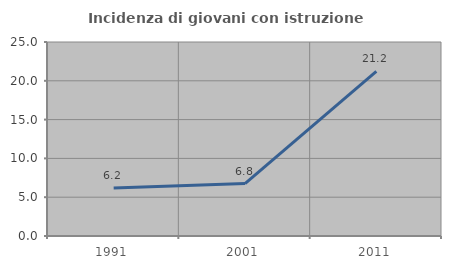
| Category | Incidenza di giovani con istruzione universitaria |
|---|---|
| 1991.0 | 6.186 |
| 2001.0 | 6.757 |
| 2011.0 | 21.212 |